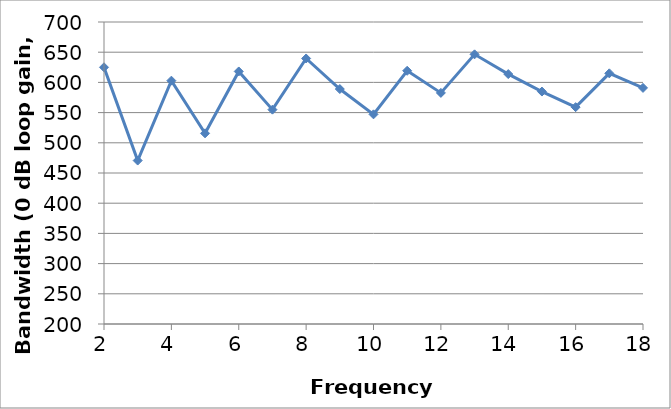
| Category | Series 0 |
|---|---|
| 2.0 | 625.052 |
| 3.0 | 470.6 |
| 4.0 | 602.865 |
| 5.0 | 515.683 |
| 6.0 | 618.103 |
| 7.0 | 554.879 |
| 8.0 | 639.62 |
| 9.0 | 589 |
| 10.0 | 547.123 |
| 11.0 | 619.241 |
| 12.0 | 582.65 |
| 13.0 | 646.475 |
| 14.0 | 613.794 |
| 15.0 | 584.855 |
| 16.0 | 559.021 |
| 17.0 | 615.005 |
| 18.0 | 590.884 |